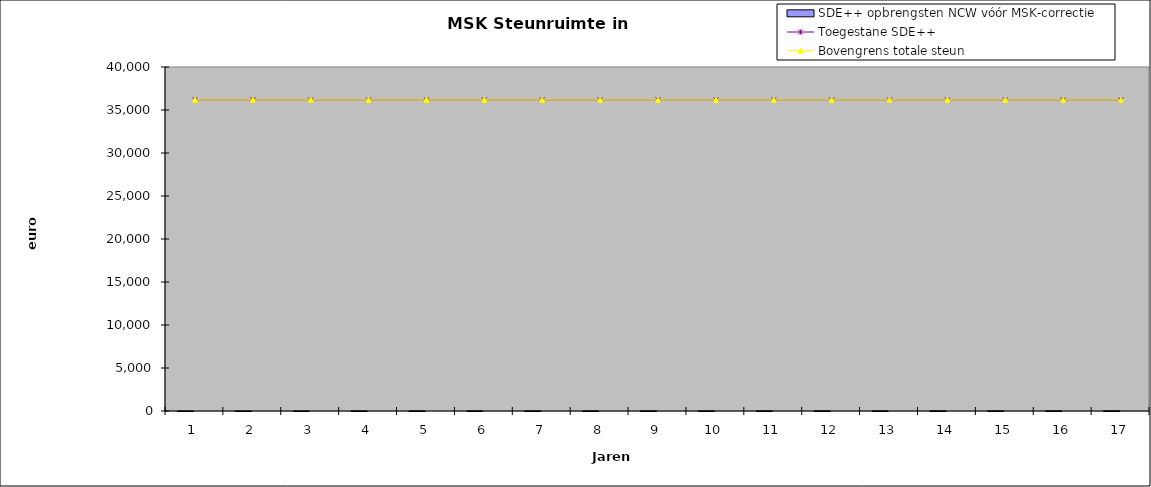
| Category | jaar | SDE++ opbrengsten NCW vóór MSK-correctie |
|---|---|---|
| 0 | 1 | 0 |
| 1 | 2 | 0 |
| 2 | 3 | 0 |
| 3 | 4 | 0 |
| 4 | 5 | 0 |
| 5 | 6 | 0 |
| 6 | 7 | 0 |
| 7 | 8 | 0 |
| 8 | 9 | 0 |
| 9 | 10 | 0 |
| 10 | 11 | 0 |
| 11 | 12 | 0 |
| 12 | 13 | 0 |
| 13 | 14 | 0 |
| 14 | 15 | 0 |
| 15 | 16 | 0 |
| 16 | 17 | 0 |